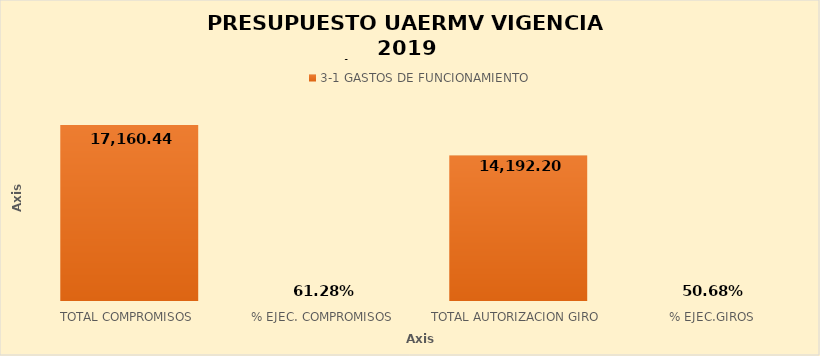
| Category | 3-1 |
|---|---|
| TOTAL COMPROMISOS | 17160.444 |
| % EJEC. COMPROMISOS | 0.613 |
| TOTAL AUTORIZACION GIRO | 14192.2 |
| % EJEC.GIROS | 0.507 |